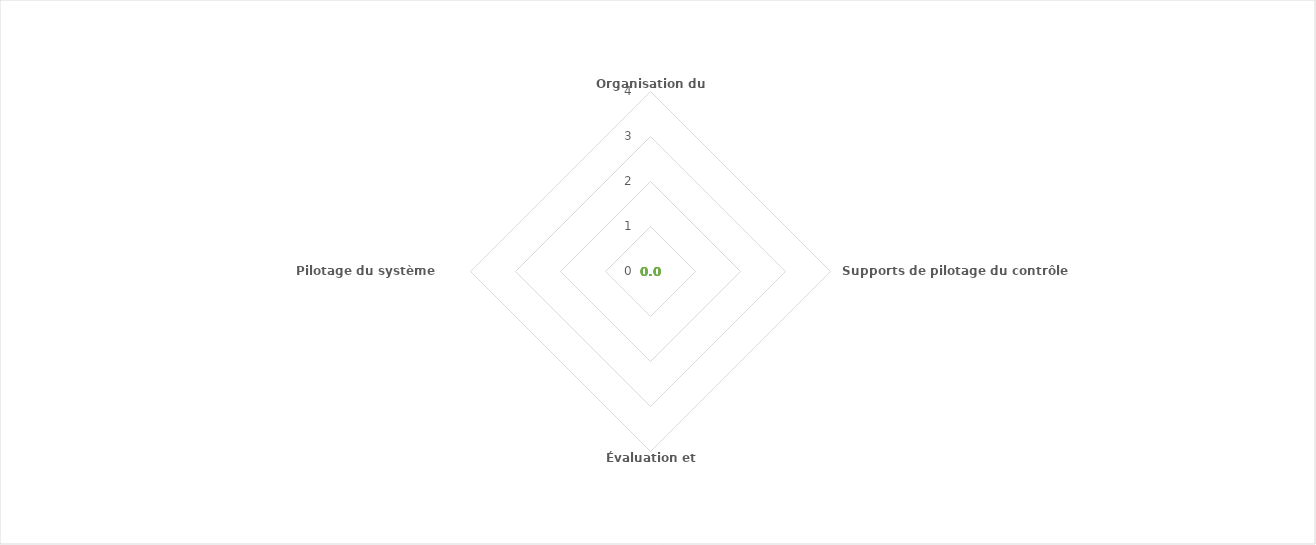
| Category | Series 0 |
|---|---|
| Organisation du dispositif | 0 |
| Supports de pilotage du contrôle interne | 0 |
| Évaluation et reporting | 0 |
| Pilotage du système d'information | 0 |